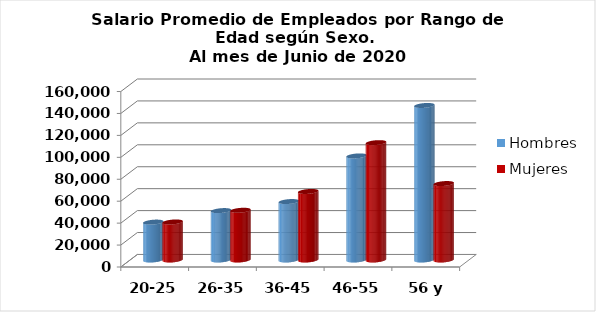
| Category | Hombres | Mujeres |
|---|---|---|
| 20-25 | 34555.83 | 34671.44 |
| 26-35 | 45047.933 | 45347.402 |
| 36-45 | 53300.11 | 62494.45 |
| 46-55 | 94911.577 | 107016.39 |
| 56 y más | 140896.94 | 69708.89 |